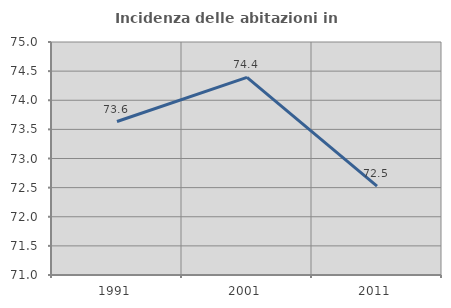
| Category | Incidenza delle abitazioni in proprietà  |
|---|---|
| 1991.0 | 73.635 |
| 2001.0 | 74.391 |
| 2011.0 | 72.527 |